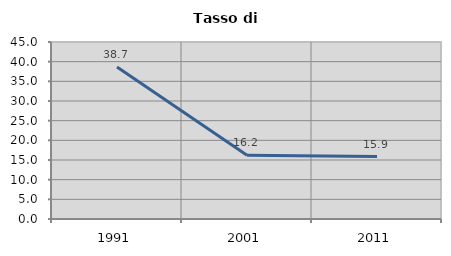
| Category | Tasso di disoccupazione   |
|---|---|
| 1991.0 | 38.652 |
| 2001.0 | 16.222 |
| 2011.0 | 15.87 |